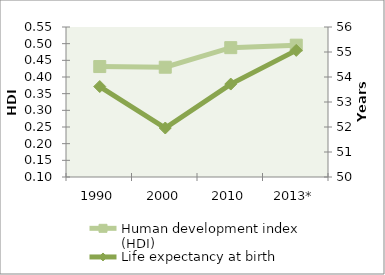
| Category | Human development index (HDI) |
|---|---|
| 1990 | 0.431 |
| 2000 | 0.429 |
| 2010 | 0.488 |
| 2013* | 0.495 |